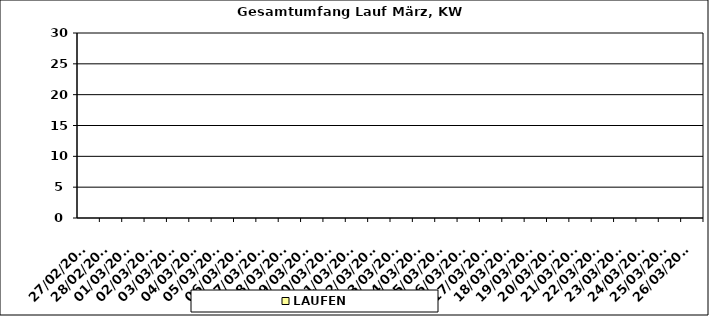
| Category | LAUFEN |
|---|---|
| 27/02/2023 | 0 |
| 28/02/2023 | 0 |
| 01/03/2023 | 0 |
| 02/03/2023 | 0 |
| 03/03/2023 | 0 |
| 04/03/2023 | 0 |
| 05/03/2023 | 0 |
| 06/03/2023 | 0 |
| 07/03/2023 | 0 |
| 08/03/2023 | 0 |
| 09/03/2023 | 0 |
| 10/03/2023 | 0 |
| 11/03/2023 | 0 |
| 12/03/2023 | 0 |
| 13/03/2023 | 0 |
| 14/03/2023 | 0 |
| 15/03/2023 | 0 |
| 16/03/2023 | 0 |
| 17/03/2023 | 0 |
| 18/03/2023 | 0 |
| 19/03/2023 | 0 |
| 20/03/2023 | 0 |
| 21/03/2023 | 0 |
| 22/03/2023 | 0 |
| 23/03/2023 | 0 |
| 24/03/2023 | 0 |
| 25/03/2023 | 0 |
| 26/03/2023 | 0 |